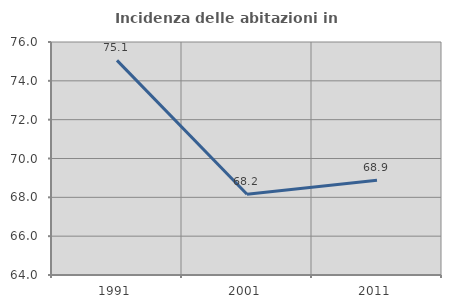
| Category | Incidenza delle abitazioni in proprietà  |
|---|---|
| 1991.0 | 75.053 |
| 2001.0 | 68.161 |
| 2011.0 | 68.881 |